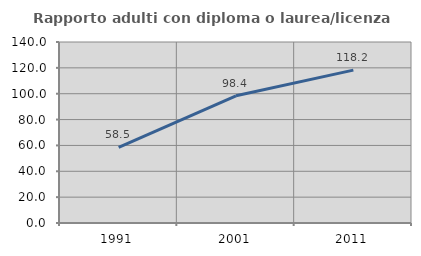
| Category | Rapporto adulti con diploma o laurea/licenza media  |
|---|---|
| 1991.0 | 58.516 |
| 2001.0 | 98.377 |
| 2011.0 | 118.223 |